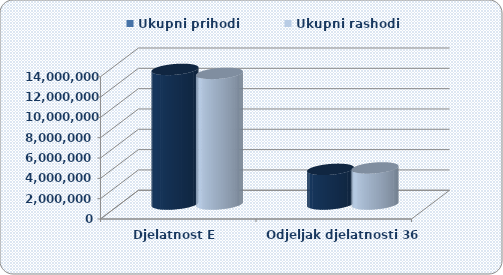
| Category | Ukupni prihodi  | Ukupni rashodi  |
|---|---|---|
| Djelatnost E  | 13247611.838 | 12854623.91 |
| Odjeljak djelatnosti 36 | 3408158.926 | 3550446.914 |